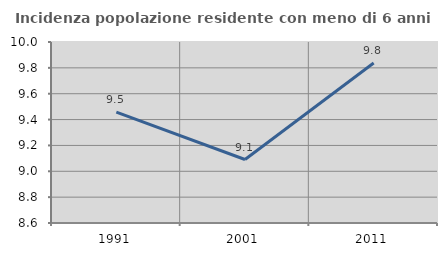
| Category | Incidenza popolazione residente con meno di 6 anni |
|---|---|
| 1991.0 | 9.457 |
| 2001.0 | 9.091 |
| 2011.0 | 9.838 |